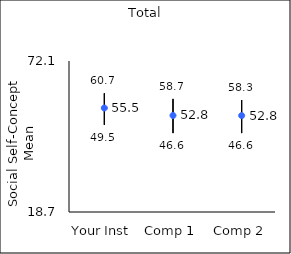
| Category | 25th percentile | 75th percentile | Mean |
|---|---|---|---|
| Your Inst | 49.5 | 60.7 | 55.48 |
| Comp 1 | 46.6 | 58.7 | 52.83 |
| Comp 2 | 46.6 | 58.3 | 52.79 |